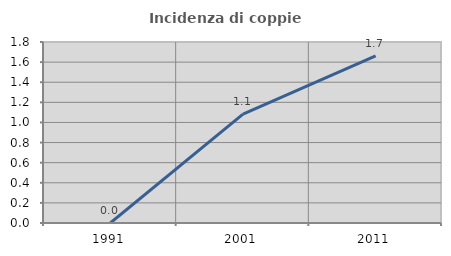
| Category | Incidenza di coppie miste |
|---|---|
| 1991.0 | 0 |
| 2001.0 | 1.083 |
| 2011.0 | 1.661 |